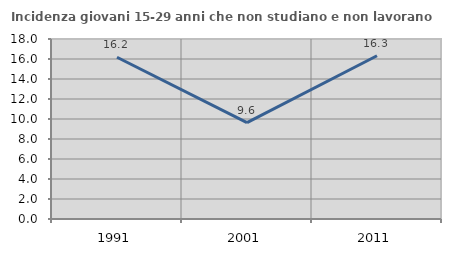
| Category | Incidenza giovani 15-29 anni che non studiano e non lavorano  |
|---|---|
| 1991.0 | 16.173 |
| 2001.0 | 9.639 |
| 2011.0 | 16.322 |